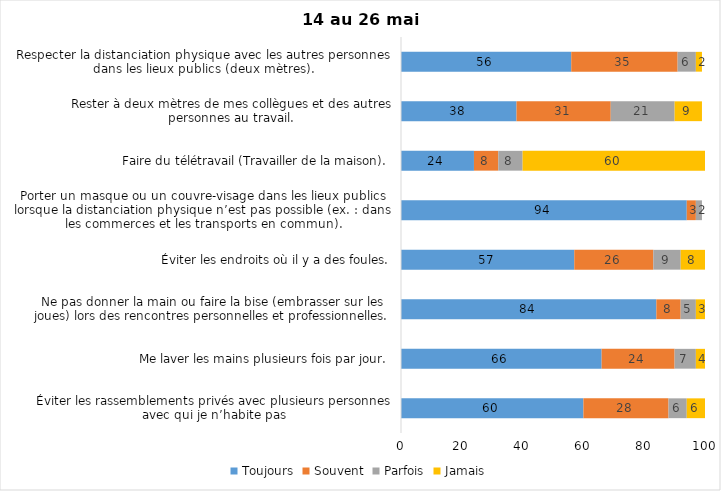
| Category | Toujours | Souvent | Parfois | Jamais |
|---|---|---|---|---|
| Éviter les rassemblements privés avec plusieurs personnes avec qui je n’habite pas | 60 | 28 | 6 | 6 |
| Me laver les mains plusieurs fois par jour. | 66 | 24 | 7 | 4 |
| Ne pas donner la main ou faire la bise (embrasser sur les joues) lors des rencontres personnelles et professionnelles. | 84 | 8 | 5 | 3 |
| Éviter les endroits où il y a des foules. | 57 | 26 | 9 | 8 |
| Porter un masque ou un couvre-visage dans les lieux publics lorsque la distanciation physique n’est pas possible (ex. : dans les commerces et les transports en commun). | 94 | 3 | 2 | 0 |
| Faire du télétravail (Travailler de la maison). | 24 | 8 | 8 | 60 |
| Rester à deux mètres de mes collègues et des autres personnes au travail. | 38 | 31 | 21 | 9 |
| Respecter la distanciation physique avec les autres personnes dans les lieux publics (deux mètres). | 56 | 35 | 6 | 2 |